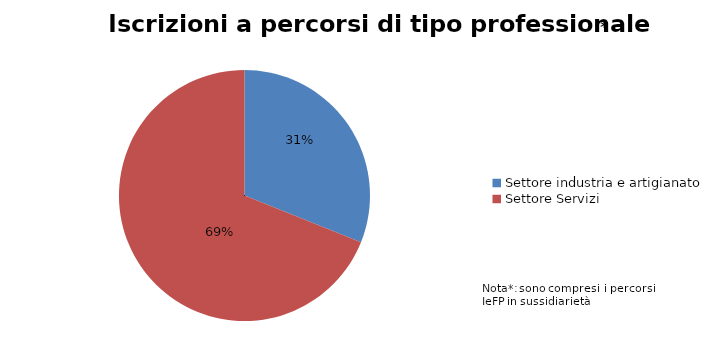
| Category | Series 0 |
|---|---|
| Settore industria e artigianato | 2219 |
| Settore Servizi | 4921 |